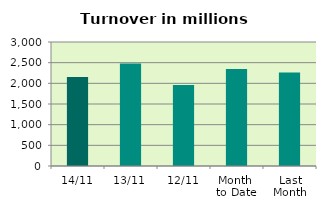
| Category | Series 0 |
|---|---|
| 14/11 | 2156.064 |
| 13/11 | 2479.636 |
| 12/11 | 1958.68 |
| Month 
to Date | 2345.735 |
| Last
Month | 2263.558 |